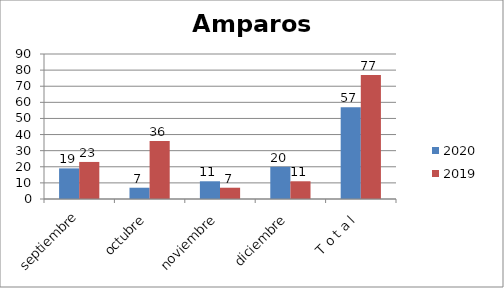
| Category | 2020 | 2019 |
|---|---|---|
| septiembre | 19 | 23 |
| octubre | 7 | 36 |
| noviembre | 11 | 7 |
| diciembre | 20 | 11 |
| T o t a l | 57 | 77 |